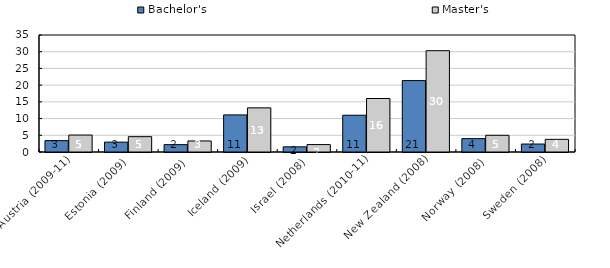
| Category | Bachelor's  | Master's |
|---|---|---|
| Austria (2009-11) | 3.399 | 5.071 |
| Estonia (2009) | 2.954 | 4.587 |
| Finland (2009) | 2.2 | 3.3 |
| Iceland (2009) | 11.1 | 13.2 |
| Israel (2008) | 1.54 | 2.22 |
| Netherlands (2010-11) | 11 | 16 |
| New Zealand (2008) | 21.358 | 30.303 |
| Norway (2008) | 4 | 5 |
| Sweden (2008) | 2.383 | 3.786 |